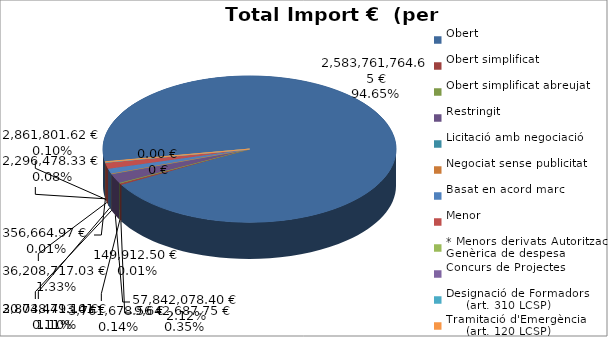
| Category | Total preu
(amb IVA) |
|---|---|
| Obert | 2583761764.65 |
| Obert simplificat | 9642687.75 |
| Obert simplificat abreujat | 3761678.56 |
| Restringit | 57842078.4 |
| Licitació amb negociació | 149912.5 |
| Negociat sense publicitat | 2873449.1 |
| Basat en acord marc | 30048713.41 |
| Menor | 36208717.03 |
| * Menors derivats Autorització Genèrica de despesa | 2861801.62 |
| Concurs de Projectes | 0 |
| Designació de Formadors
     (art. 310 LCSP) | 356664.97 |
| Tramitació d'Emergència
     (art. 120 LCSP) | 2296478.33 |